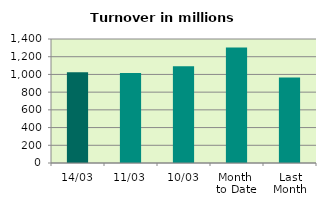
| Category | Series 0 |
|---|---|
| 14/03 | 1023.585 |
| 11/03 | 1017.246 |
| 10/03 | 1091.985 |
| Month 
to Date | 1304.313 |
| Last
Month | 966.674 |